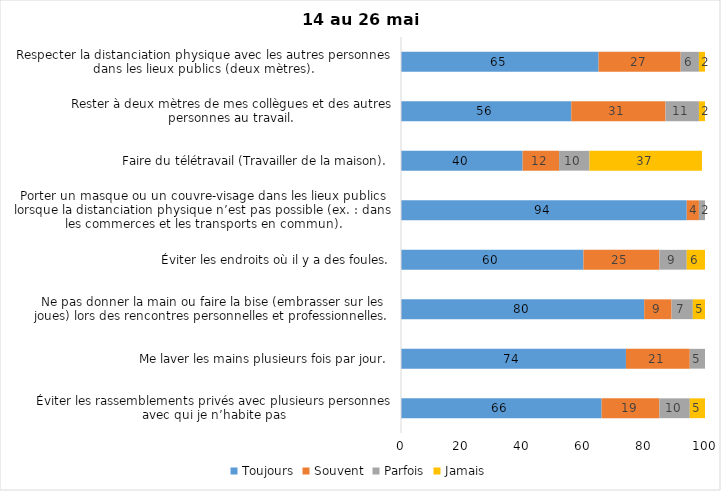
| Category | Toujours | Souvent | Parfois | Jamais |
|---|---|---|---|---|
| Éviter les rassemblements privés avec plusieurs personnes avec qui je n’habite pas | 66 | 19 | 10 | 5 |
| Me laver les mains plusieurs fois par jour. | 74 | 21 | 5 | 0 |
| Ne pas donner la main ou faire la bise (embrasser sur les joues) lors des rencontres personnelles et professionnelles. | 80 | 9 | 7 | 5 |
| Éviter les endroits où il y a des foules. | 60 | 25 | 9 | 6 |
| Porter un masque ou un couvre-visage dans les lieux publics lorsque la distanciation physique n’est pas possible (ex. : dans les commerces et les transports en commun). | 94 | 4 | 2 | 0 |
| Faire du télétravail (Travailler de la maison). | 40 | 12 | 10 | 37 |
| Rester à deux mètres de mes collègues et des autres personnes au travail. | 56 | 31 | 11 | 2 |
| Respecter la distanciation physique avec les autres personnes dans les lieux publics (deux mètres). | 65 | 27 | 6 | 2 |